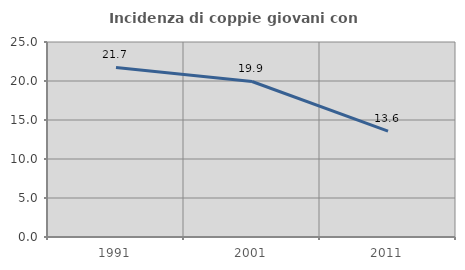
| Category | Incidenza di coppie giovani con figli |
|---|---|
| 1991.0 | 21.731 |
| 2001.0 | 19.938 |
| 2011.0 | 13.583 |